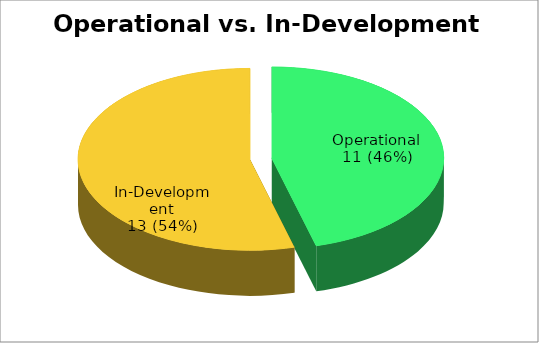
| Category | Series 0 |
|---|---|
| Is the MSDI operational? | 11 |
| In Development? | 13 |